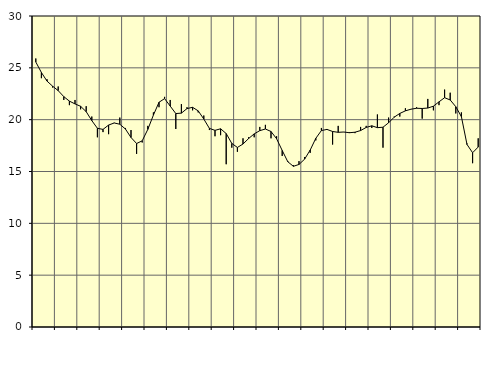
| Category | Piggar | Series 1 |
|---|---|---|
| nan | 25.9 | 25.56 |
| 1.0 | 24 | 24.55 |
| 1.0 | 23.9 | 23.72 |
| 1.0 | 23.1 | 23.23 |
| nan | 23.2 | 22.8 |
| 2.0 | 21.9 | 22.22 |
| 2.0 | 21.4 | 21.79 |
| 2.0 | 21.9 | 21.52 |
| nan | 21 | 21.29 |
| 3.0 | 21.3 | 20.77 |
| 3.0 | 20.3 | 19.91 |
| 3.0 | 18.3 | 19.17 |
| nan | 18.8 | 19.06 |
| 4.0 | 18.6 | 19.48 |
| 4.0 | 19.7 | 19.68 |
| 4.0 | 20.2 | 19.56 |
| nan | 19.2 | 19.1 |
| 5.0 | 19 | 18.28 |
| 5.0 | 16.7 | 17.7 |
| 5.0 | 17.8 | 17.96 |
| nan | 19.4 | 19.06 |
| 6.0 | 20.7 | 20.44 |
| 6.0 | 21.2 | 21.68 |
| 6.0 | 22.2 | 22.03 |
| nan | 21.9 | 21.31 |
| 7.0 | 19.1 | 20.59 |
| 7.0 | 21.5 | 20.63 |
| 7.0 | 21.2 | 21.07 |
| nan | 20.9 | 21.19 |
| 8.0 | 20.7 | 20.85 |
| 8.0 | 20.4 | 20.06 |
| 8.0 | 19 | 19.16 |
| nan | 18.4 | 18.97 |
| 9.0 | 18.5 | 19.12 |
| 9.0 | 15.7 | 18.66 |
| 9.0 | 17.3 | 17.71 |
| nan | 16.9 | 17.32 |
| 10.0 | 18.2 | 17.65 |
| 10.0 | 18.3 | 18.18 |
| 10.0 | 18.3 | 18.63 |
| nan | 19.3 | 18.94 |
| 11.0 | 19.5 | 19.1 |
| 11.0 | 18.2 | 18.86 |
| 11.0 | 18.4 | 18.16 |
| nan | 16.5 | 17.03 |
| 12.0 | 16 | 15.94 |
| 12.0 | 15.6 | 15.5 |
| 12.0 | 16 | 15.68 |
| nan | 16.4 | 16.19 |
| 13.0 | 16.8 | 17.07 |
| 13.0 | 18 | 18.2 |
| 13.0 | 19.2 | 18.95 |
| nan | 19.1 | 19.06 |
| 14.0 | 17.6 | 18.86 |
| 14.0 | 19.4 | 18.78 |
| 14.0 | 18.8 | 18.81 |
| nan | 18.8 | 18.74 |
| 15.0 | 18.7 | 18.79 |
| 15.0 | 19.3 | 18.95 |
| 15.0 | 19.4 | 19.25 |
| nan | 19.2 | 19.41 |
| 16.0 | 20.5 | 19.23 |
| 16.0 | 17.3 | 19.27 |
| 16.0 | 20.2 | 19.7 |
| nan | 20.3 | 20.24 |
| 17.0 | 20.3 | 20.6 |
| 17.0 | 21.1 | 20.85 |
| 17.0 | 21 | 21.01 |
| nan | 21.2 | 21.1 |
| 18.0 | 20.1 | 21.08 |
| 18.0 | 22 | 21.12 |
| 18.0 | 20.9 | 21.3 |
| nan | 21.4 | 21.72 |
| 19.0 | 22.9 | 22.12 |
| 19.0 | 22.6 | 21.9 |
| 19.0 | 20.6 | 21.25 |
| nan | 20.7 | 20.29 |
| 20.0 | 17.7 | 17.61 |
| 20.0 | 15.8 | 16.81 |
| 20.0 | 18.2 | 17.36 |